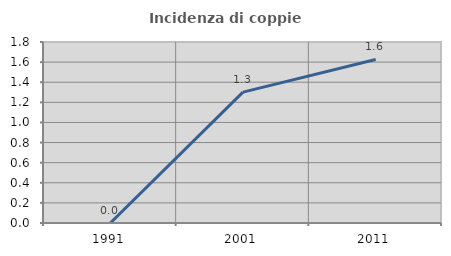
| Category | Incidenza di coppie miste |
|---|---|
| 1991.0 | 0 |
| 2001.0 | 1.301 |
| 2011.0 | 1.626 |